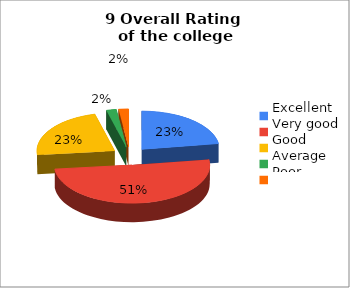
| Category | 9 Overall Rating 
of the college |
|---|---|
| Excellent | 33 |
| Very good | 74 |
| Good | 33 |
| Average | 3 |
| Poor | 3 |